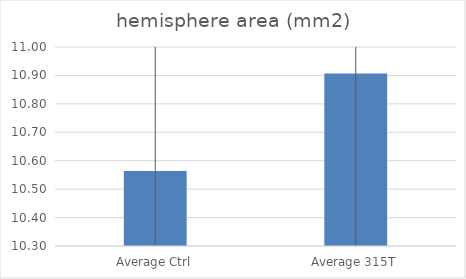
| Category | hemisphere area (mm2) |
|---|---|
| Average Ctrl | 10.564 |
| Average 315T | 10.907 |